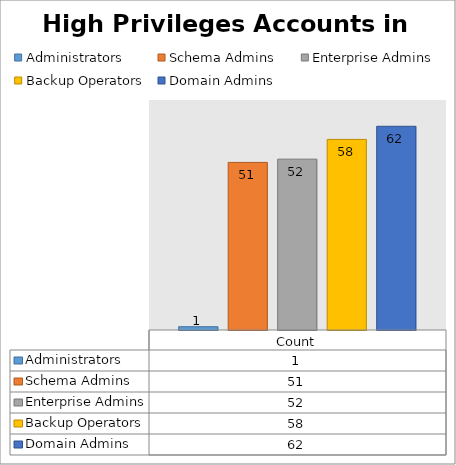
| Category | Administrators | Schema Admins | Enterprise Admins | Backup Operators | Domain Admins |
|---|---|---|---|---|---|
| Count | 1 | 51 | 52 | 58 | 62 |